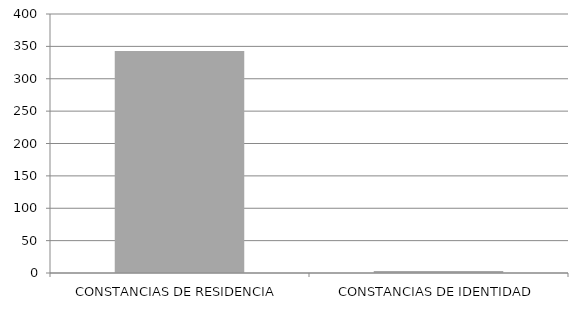
| Category | Series 0 |
|---|---|
| CONSTANCIAS DE RESIDENCIA | 343 |
| CONSTANCIAS DE IDENTIDAD | 3 |